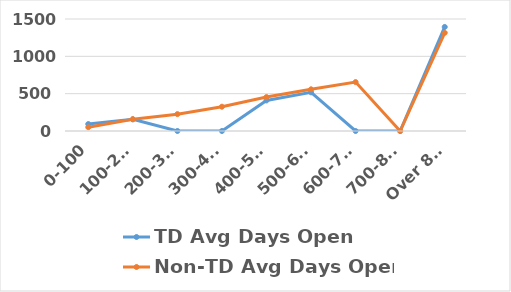
| Category | TD Avg Days Open  | Non-TD Avg Days Open  |
|---|---|---|
| 0-100 | 92.926 | 50.832 |
| 100-200 | 156.06 | 158.584 |
| 200-300 | 0 | 225.766 |
| 300-400 | 0 | 325.323 |
| 400-500 | 409.519 | 454.314 |
| 500-600 | 517.695 | 558.383 |
| 600-700 | 0 | 655.127 |
| 700-800 | 0 | 0 |
| Over 800 | 1393.516 | 1315.419 |